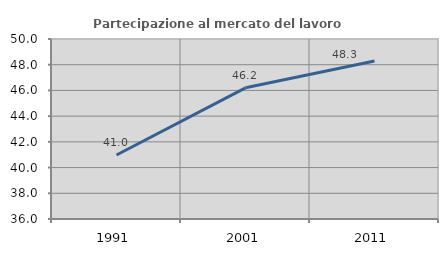
| Category | Partecipazione al mercato del lavoro  femminile |
|---|---|
| 1991.0 | 40.974 |
| 2001.0 | 46.204 |
| 2011.0 | 48.286 |